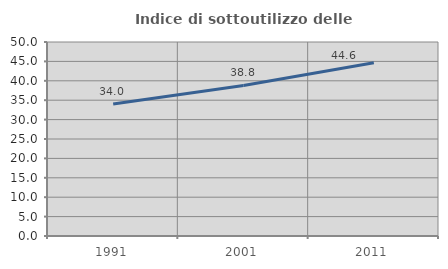
| Category | Indice di sottoutilizzo delle abitazioni  |
|---|---|
| 1991.0 | 34.013 |
| 2001.0 | 38.808 |
| 2011.0 | 44.632 |